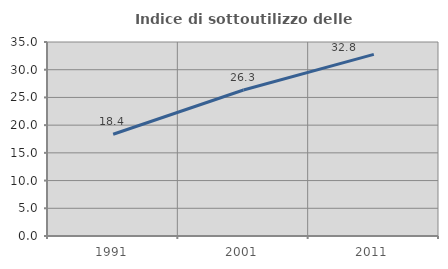
| Category | Indice di sottoutilizzo delle abitazioni  |
|---|---|
| 1991.0 | 18.353 |
| 2001.0 | 26.333 |
| 2011.0 | 32.771 |